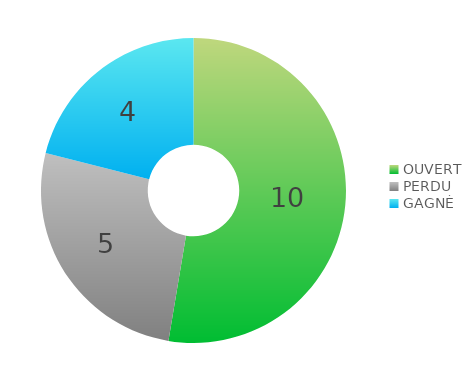
| Category | Series 0 |
|---|---|
| OUVERT | 10 |
| PERDU | 5 |
| GAGNÉ | 4 |